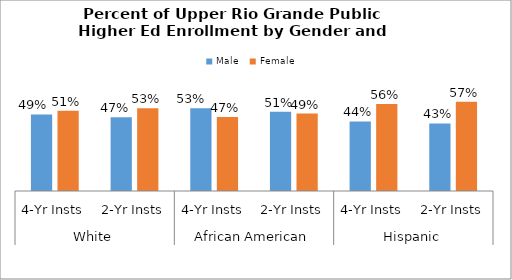
| Category | Male | Female |
|---|---|---|
| 0 | 0.488 | 0.512 |
| 1 | 0.471 | 0.529 |
| 2 | 0.528 | 0.472 |
| 3 | 0.506 | 0.494 |
| 4 | 0.444 | 0.556 |
| 5 | 0.431 | 0.569 |